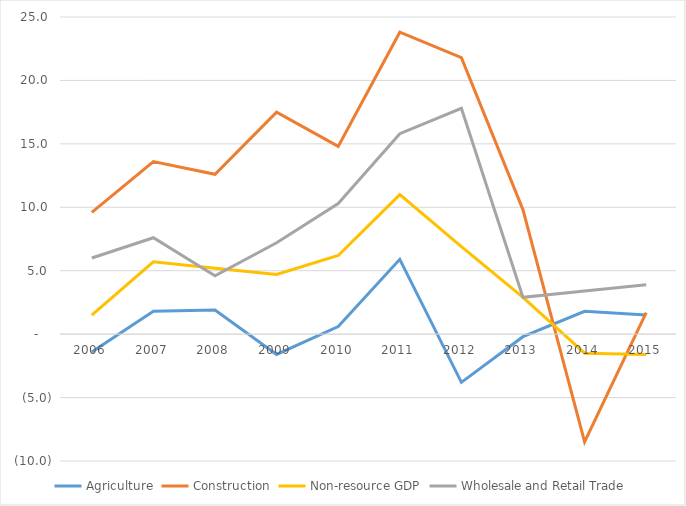
| Category | Agriculture | Construction | Non-resource GDP | Wholesale and Retail Trade |
|---|---|---|---|---|
| 2006.0 | -1.4 | 9.6 | 1.5 | 6 |
| 2007.0 | 1.8 | 13.6 | 5.7 | 7.6 |
| 2008.0 | 1.9 | 12.6 | 5.2 | 4.6 |
| 2009.0 | -1.6 | 17.5 | 4.7 | 7.2 |
| 2010.0 | 0.6 | 14.8 | 6.2 | 10.3 |
| 2011.0 | 5.9 | 23.8 | 11 | 15.8 |
| 2012.0 | -3.8 | 21.8 | 6.9 | 17.8 |
| 2013.0 | -0.2 | 9.8 | 2.9 | 2.9 |
| 2014.0 | 1.8 | -8.5 | -1.5 | 3.4 |
| 2015.0 | 1.5 | 1.7 | -1.6 | 3.9 |